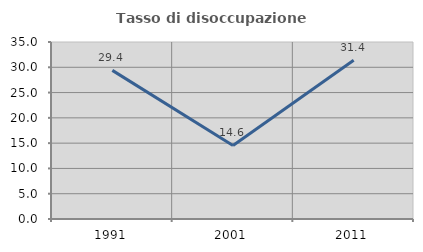
| Category | Tasso di disoccupazione giovanile  |
|---|---|
| 1991.0 | 29.389 |
| 2001.0 | 14.551 |
| 2011.0 | 31.402 |